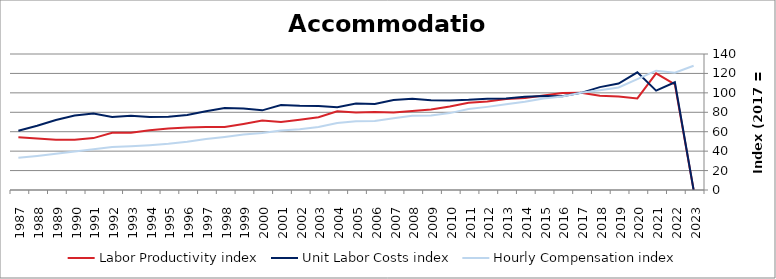
| Category | Labor Productivity index | Unit Labor Costs index | Hourly Compensation index |
|---|---|---|---|
| 2023.0 | 0 | 0 | 127.916 |
| 2022.0 | 108.802 | 110.881 | 120.64 |
| 2021.0 | 120.065 | 102.306 | 122.834 |
| 2020.0 | 94.222 | 121.173 | 114.172 |
| 2019.0 | 96.239 | 109.621 | 105.498 |
| 2018.0 | 96.961 | 105.927 | 102.707 |
| 2017.0 | 100 | 100 | 100 |
| 2016.0 | 99.815 | 96.406 | 96.227 |
| 2015.0 | 97.382 | 96.685 | 94.153 |
| 2014.0 | 94.631 | 96.073 | 90.915 |
| 2013.0 | 93.56 | 94.319 | 88.245 |
| 2012.0 | 91.066 | 93.973 | 85.577 |
| 2011.0 | 89.761 | 92.834 | 83.329 |
| 2010.0 | 85.894 | 92.144 | 79.146 |
| 2009.0 | 82.905 | 92.43 | 76.629 |
| 2008.0 | 81.312 | 94.027 | 76.455 |
| 2007.0 | 79.867 | 92.62 | 73.972 |
| 2006.0 | 80.229 | 88.607 | 71.089 |
| 2005.0 | 79.658 | 88.935 | 70.844 |
| 2004.0 | 81.075 | 85.106 | 69 |
| 2003.0 | 74.982 | 86.416 | 64.797 |
| 2002.0 | 72.27 | 86.61 | 62.593 |
| 2001.0 | 69.978 | 87.537 | 61.256 |
| 2000.0 | 71.65 | 81.985 | 58.742 |
| 1999.0 | 68.046 | 83.838 | 57.048 |
| 1998.0 | 64.773 | 84.401 | 54.669 |
| 1997.0 | 64.727 | 81.074 | 52.477 |
| 1996.0 | 64.421 | 77.282 | 49.786 |
| 1995.0 | 63.25 | 75.326 | 47.644 |
| 1994.0 | 61.505 | 75.035 | 46.151 |
| 1993.0 | 58.932 | 76.469 | 45.065 |
| 1992.0 | 58.878 | 75.23 | 44.294 |
| 1991.0 | 53.409 | 78.715 | 42.041 |
| 1990.0 | 51.735 | 76.588 | 39.623 |
| 1989.0 | 51.676 | 72.019 | 37.217 |
| 1988.0 | 53.077 | 66.107 | 35.088 |
| 1987.0 | 54.333 | 61.001 | 33.143 |